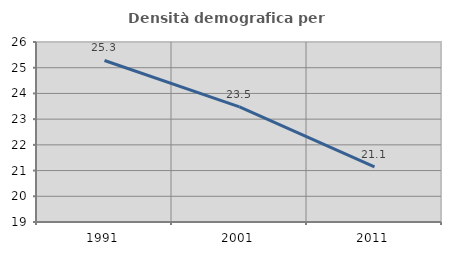
| Category | Densità demografica |
|---|---|
| 1991.0 | 25.281 |
| 2001.0 | 23.477 |
| 2011.0 | 21.14 |